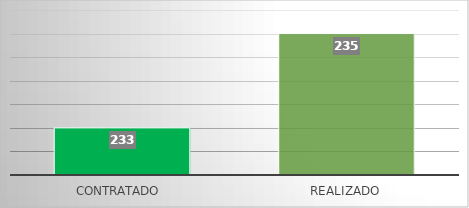
| Category | Series 0 |
|---|---|
| Contratado  | 233 |
| Realizado | 235 |